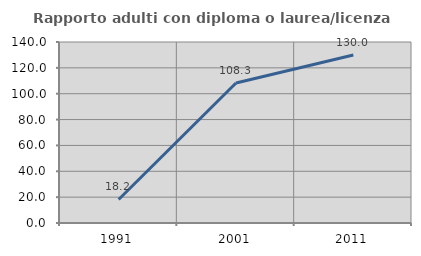
| Category | Rapporto adulti con diploma o laurea/licenza media  |
|---|---|
| 1991.0 | 18.182 |
| 2001.0 | 108.333 |
| 2011.0 | 130 |